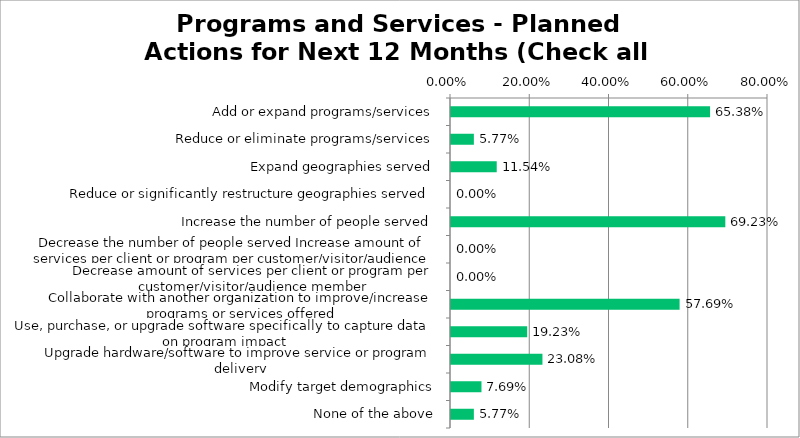
| Category | Responses |
|---|---|
| Add or expand programs/services | 0.654 |
| Reduce or eliminate programs/services | 0.058 |
| Expand geographies served | 0.115 |
| Reduce or significantly restructure geographies served | 0 |
| Increase the number of people served | 0.692 |
| Decrease the number of people served Increase amount of services per client or program per customer/visitor/audience member | 0 |
| Decrease amount of services per client or program per customer/visitor/audience member | 0 |
| Collaborate with another organization to improve/increase programs or services offered | 0.577 |
| Use, purchase, or upgrade software specifically to capture data on program impact | 0.192 |
| Upgrade hardware/software to improve service or program delivery | 0.231 |
| Modify target demographics | 0.077 |
| None of the above | 0.058 |